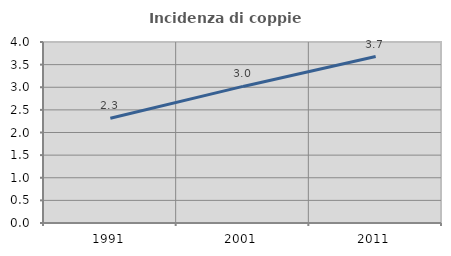
| Category | Incidenza di coppie miste |
|---|---|
| 1991.0 | 2.314 |
| 2001.0 | 3.019 |
| 2011.0 | 3.678 |